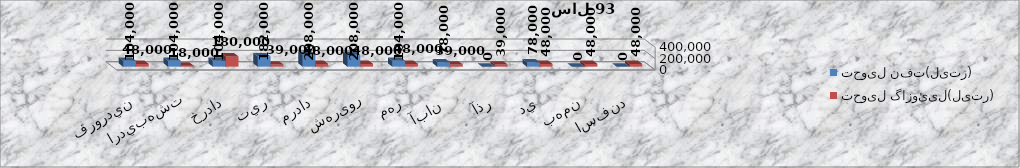
| Category | تحویل نفت(لیتر) | تحویل گازوئیل(لیتر) |
|---|---|---|
| اسفند | 0 | 48000 |
| بهمن | 0 | 48000 |
| دي | 78000 | 48000 |
| آذر | 0 | 39000 |
| آبان  | 78000 | 39000 |
| مهر | 104000 | 48000 |
| شهریور | 208000 | 48000 |
| مرداد | 208000 | 48000 |
| تير | 182000 | 39000 |
| خرداد | 104000 | 180000 |
| ارديبهشت | 104000 | 18000 |
| فروردين | 104000 | 48000 |